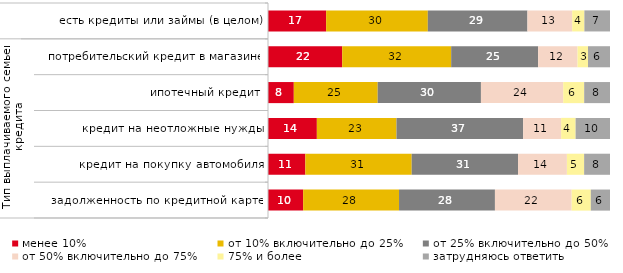
| Category | менее 10% | от 10% включительно до 25% | от 25% включительно до 50% | от 50% включительно до 75% | 75% и более | затрудняюсь ответить |
|---|---|---|---|---|---|---|
| 0 | 17.004 | 29.727 | 29.132 | 13.08 | 3.567 | 7.491 |
| 1 | 21.695 | 31.864 | 25.424 | 11.525 | 3.051 | 6.441 |
| 2 | 7.547 | 24.528 | 30.189 | 24.057 | 6.132 | 7.547 |
| 3 | 14.286 | 23.28 | 37.037 | 11.111 | 4.233 | 10.053 |
| 4 | 10.924 | 31.092 | 31.092 | 14.286 | 5.042 | 7.563 |
| 5 | 10.28 | 28.037 | 28.037 | 22.43 | 5.607 | 5.607 |